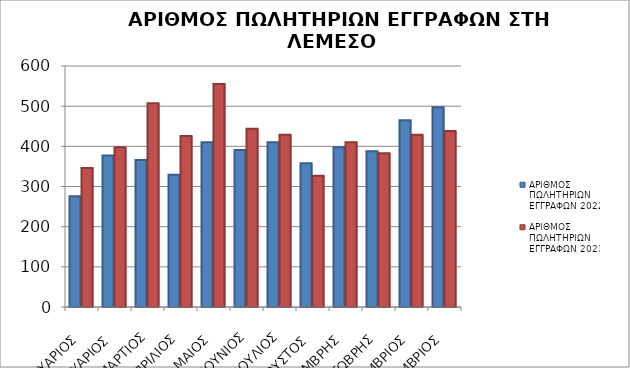
| Category | Συνολικό Αποδεχθέν Ποσό Υποθεσέων Ν81/70 (με επιτόπια έρευνα): | ΑΡΙΘΜΟΣ ΠΩΛΗΤΗΡΙΩΝ ΕΓΓΡΑΦΩΝ 2022 | ΑΡΙΘΜΟΣ ΠΩΛΗΤΗΡΙΩΝ ΕΓΓΡΑΦΩΝ 2023 |
|---|---|---|---|
| ΙΑΝΟΥΑΡΙΟΣ |  | 276 | 346 |
| ΦΕΒΡΟΥΑΡΙΟΣ |  | 377 | 398 |
| ΜΑΡΤΙΟΣ |  | 366 | 507 |
| ΑΠΡΙΛΙΟΣ |  | 329 | 426 |
| ΜΑΙΟΣ |  | 410 | 555 |
| ΙΟΥΝΙΟΣ |  | 391 | 444 |
| ΙΟΥΛΙΟΣ |  | 410 | 429 |
| ΑΥΓΟΥΣΤΟΣ |  | 358 | 327 |
| ΣΕΠΤΕΜΒΡΗΣ |  | 398 | 410 |
| ΟΚΤΩΒΡΗΣ |  | 388 | 383 |
| ΝΟΕΜΒΡΙΟΣ |  | 465 | 429 |
| ΔΕΚΕΜΒΡΙΟΣ |  | 497 | 438 |